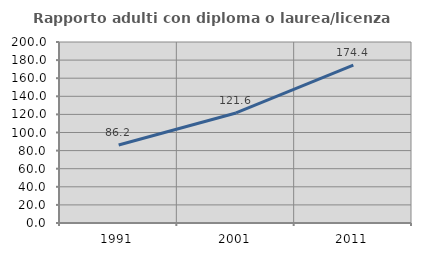
| Category | Rapporto adulti con diploma o laurea/licenza media  |
|---|---|
| 1991.0 | 86.183 |
| 2001.0 | 121.612 |
| 2011.0 | 174.399 |